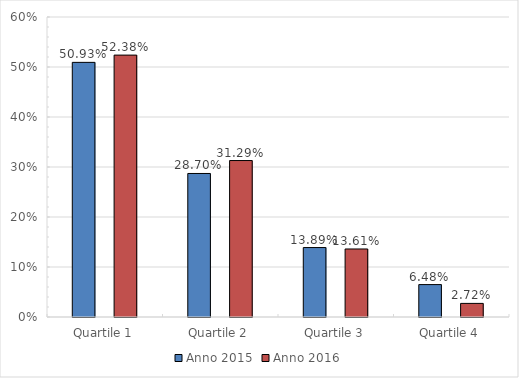
| Category | Anno 2015 | Anno 2016 |
|---|---|---|
| Quartile 1 | 0.509 | 0.524 |
| Quartile 2 | 0.287 | 0.313 |
| Quartile 3 | 0.139 | 0.136 |
| Quartile 4 | 0.065 | 0.027 |